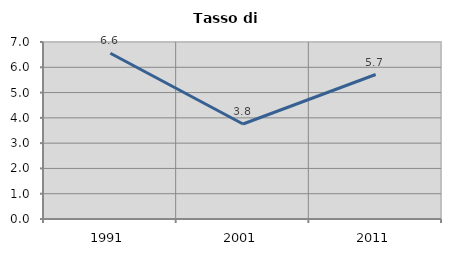
| Category | Tasso di disoccupazione   |
|---|---|
| 1991.0 | 6.556 |
| 2001.0 | 3.756 |
| 2011.0 | 5.714 |